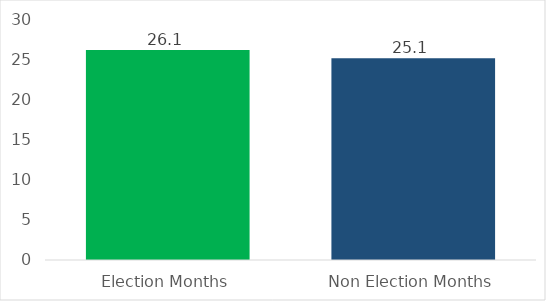
| Category | Average Monthly Payments |
|---|---|
| Election Months | 26.14 |
| Non Election Months | 25.112 |